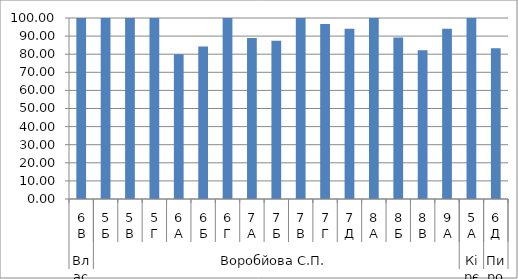
| Category | Series 0 |
|---|---|
| 0 | 100 |
| 1 | 100 |
| 2 | 100 |
| 3 | 100 |
| 4 | 80 |
| 5 | 84.211 |
| 6 | 100 |
| 7 | 88.889 |
| 8 | 87.5 |
| 9 | 100 |
| 10 | 96.667 |
| 11 | 94.118 |
| 12 | 100 |
| 13 | 89.286 |
| 14 | 82.143 |
| 15 | 94.118 |
| 16 | 100 |
| 17 | 83.333 |